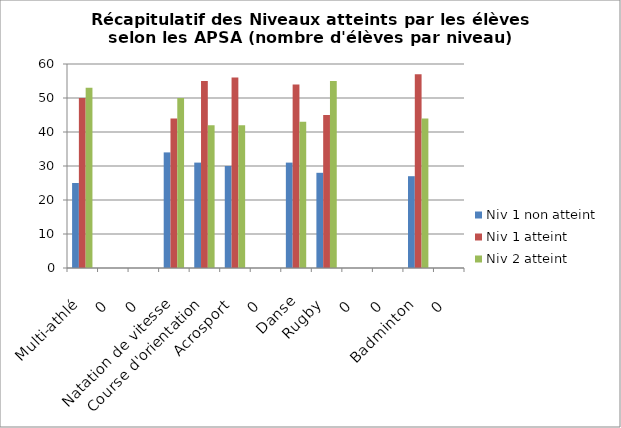
| Category | Niv 1 non atteint | Niv 1 atteint | Niv 2 atteint |
|---|---|---|---|
| Multi-athlé | 25 | 50 | 53 |
| 0 | 0 | 0 | 0 |
| 0 | 0 | 0 | 0 |
| Natation de vitesse | 34 | 44 | 50 |
| Course d'orientation | 31 | 55 | 42 |
| Acrosport | 30 | 56 | 42 |
| 0 | 0 | 0 | 0 |
| Danse | 31 | 54 | 43 |
| Rugby | 28 | 45 | 55 |
| 0 | 0 | 0 | 0 |
| 0 | 0 | 0 | 0 |
| Badminton | 27 | 57 | 44 |
| 0 | 0 | 0 | 0 |